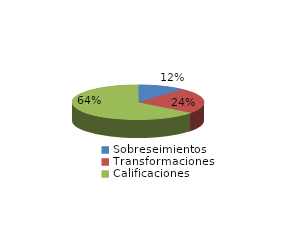
| Category | Series 0 |
|---|---|
| Sobreseimientos | 77 |
| Transformaciones | 159 |
| Calificaciones | 428 |